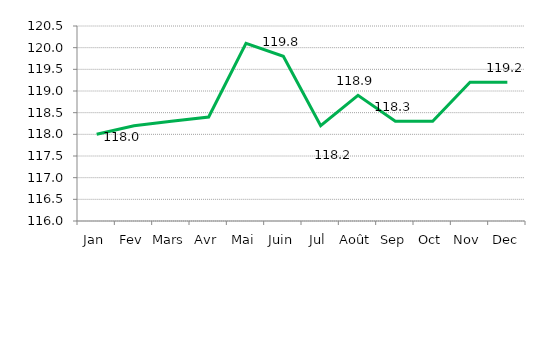
| Category |   INDICE  GENERAL     |
|---|---|
| Jan | 118 |
| Fev | 118.2 |
| Mars | 118.3 |
| Avr | 118.4 |
| Mai | 120.1 |
| Juin | 119.8 |
| Jul | 118.2 |
| Août | 118.9 |
| Sep | 118.3 |
| Oct | 118.3 |
| Nov | 119.2 |
| Dec | 119.2 |